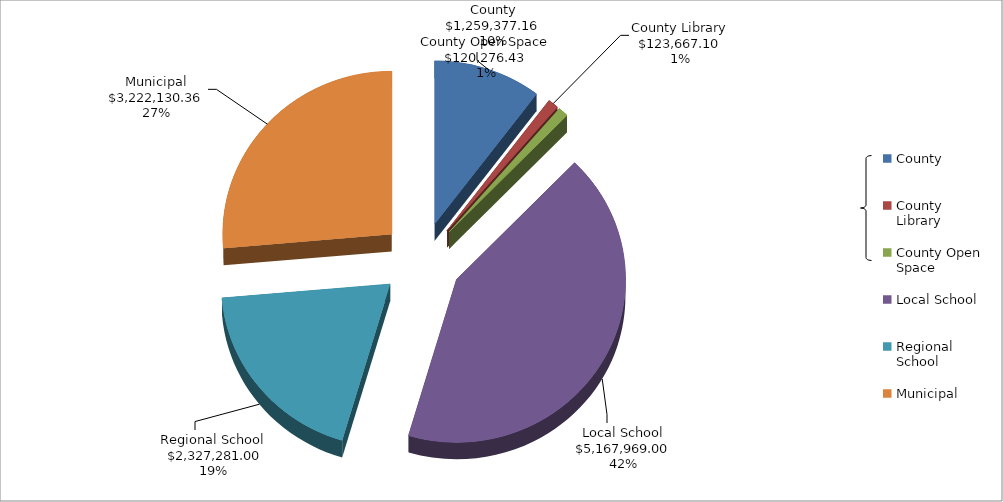
| Category | Series 3 | Series 4 | Series 2 | Series 1 | Series 0 |
|---|---|---|---|---|---|
| County | 1259377.16 | 0.327 |  |  |  |
| County Library | 123667.1 | 0.032 |  |  |  |
| County Open Space | 120276.43 | 0.031 |  |  |  |
| Local School | 5167969 | 1.342 |  |  |  |
| Regional School | 2327281 | 0.605 |  |  |  |
| Municipal | 3222130.36 | 0.803 |  |  |  |